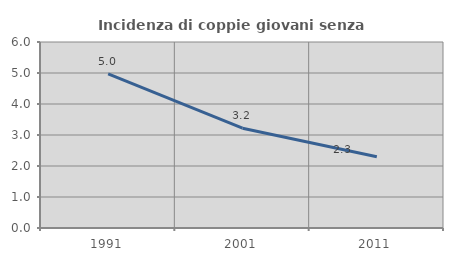
| Category | Incidenza di coppie giovani senza figli |
|---|---|
| 1991.0 | 4.97 |
| 2001.0 | 3.218 |
| 2011.0 | 2.298 |